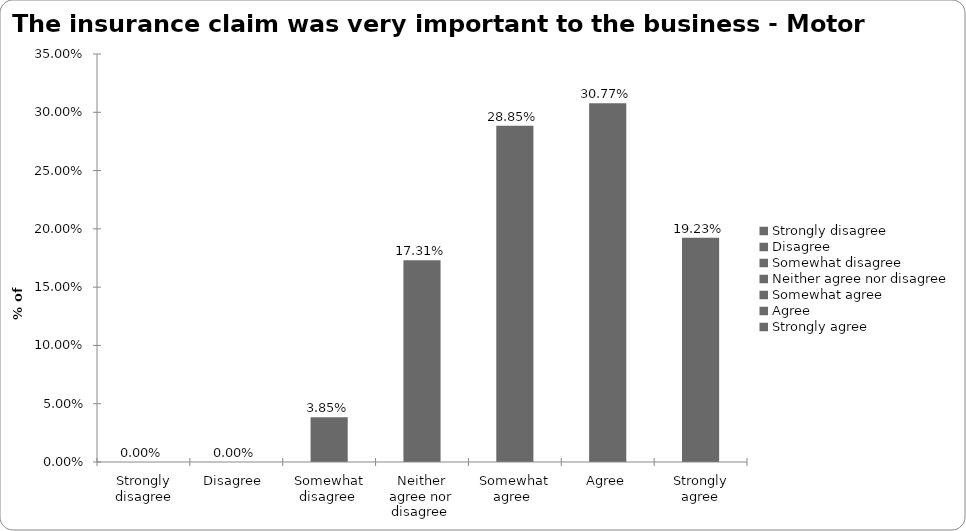
| Category | Motor |
|---|---|
| Strongly disagree | 0 |
| Disagree  | 0 |
| Somewhat disagree  | 0.038 |
| Neither agree nor disagree  | 0.173 |
| Somewhat agree  | 0.288 |
| Agree | 0.308 |
| Strongly agree | 0.192 |